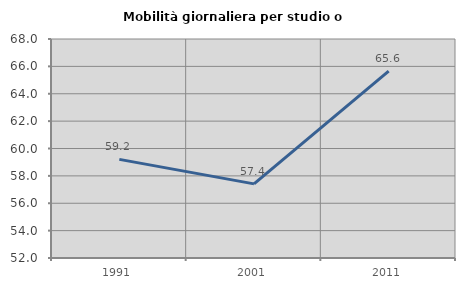
| Category | Mobilità giornaliera per studio o lavoro |
|---|---|
| 1991.0 | 59.205 |
| 2001.0 | 57.415 |
| 2011.0 | 65.647 |